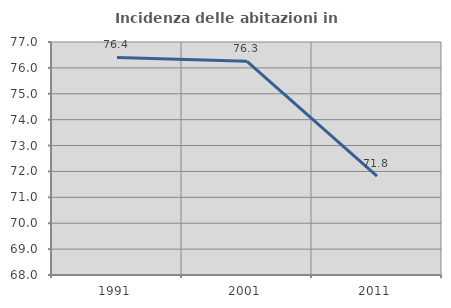
| Category | Incidenza delle abitazioni in proprietà  |
|---|---|
| 1991.0 | 76.404 |
| 2001.0 | 76.254 |
| 2011.0 | 71.823 |